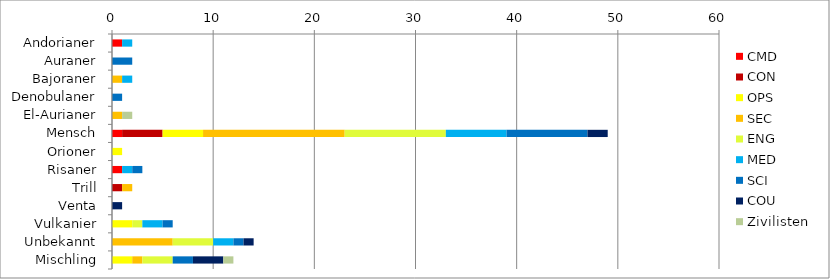
| Category | CMD | CON | OPS | SEC | ENG | MED | SCI | COU | Zivilisten |
|---|---|---|---|---|---|---|---|---|---|
| Andorianer | 1 | 0 | 0 | 0 | 0 | 1 | 0 | 0 | 0 |
| Auraner | 0 | 0 | 0 | 0 | 0 | 0 | 2 | 0 | 0 |
| Bajoraner | 0 | 0 | 0 | 1 | 0 | 1 | 0 | 0 | 0 |
| Denobulaner | 0 | 0 | 0 | 0 | 0 | 0 | 1 | 0 | 0 |
| El-Aurianer | 0 | 0 | 0 | 1 | 0 | 0 | 0 | 0 | 1 |
| Mensch | 1 | 4 | 4 | 14 | 10 | 6 | 8 | 2 | 0 |
| Orioner | 0 | 0 | 1 | 0 | 0 | 0 | 0 | 0 | 0 |
| Risaner | 1 | 0 | 0 | 0 | 0 | 1 | 1 | 0 | 0 |
| Trill | 0 | 1 | 0 | 1 | 0 | 0 | 0 | 0 | 0 |
| Venta | 0 | 0 | 0 | 0 | 0 | 0 | 0 | 1 | 0 |
| Vulkanier | 0 | 0 | 2 | 0 | 1 | 2 | 1 | 0 | 0 |
| Unbekannt | 0 | 0 | 0 | 6 | 4 | 2 | 1 | 1 | 0 |
| Mischling | 0 | 0 | 2 | 1 | 3 | 0 | 2 | 3 | 1 |